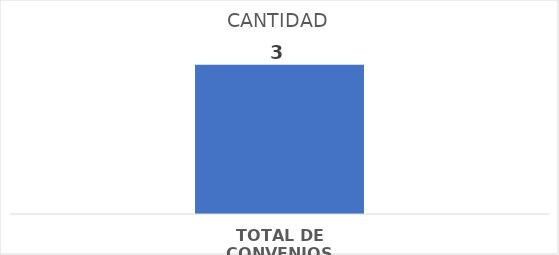
| Category | CANTIDAD |
|---|---|
| TOTAL DE CONVENIOS | 3 |